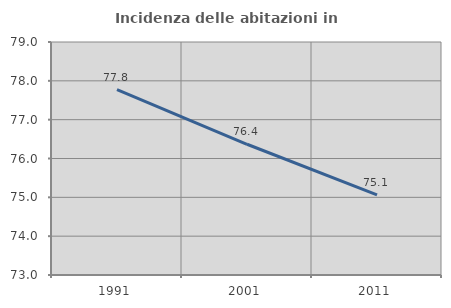
| Category | Incidenza delle abitazioni in proprietà  |
|---|---|
| 1991.0 | 77.773 |
| 2001.0 | 76.366 |
| 2011.0 | 75.063 |